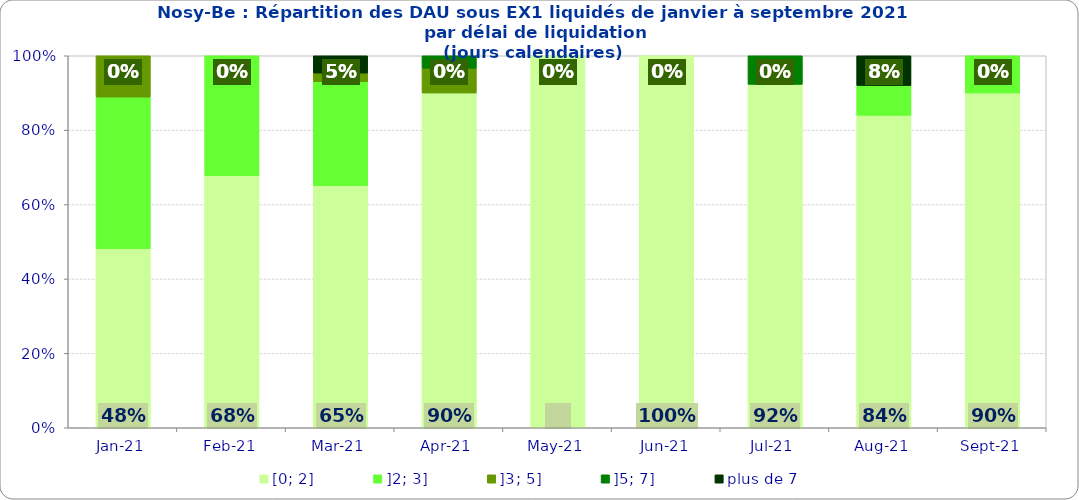
| Category | [0; 2] | ]2; 3] | ]3; 5] | ]5; 7] | plus de 7 |
|---|---|---|---|---|---|
| 2021-01-01 | 0.481 | 0.407 | 0.111 | 0 | 0 |
| 2021-02-01 | 0.677 | 0.323 | 0 | 0 | 0 |
| 2021-03-01 | 0.651 | 0.279 | 0.023 | 0 | 0.047 |
| 2021-04-01 | 0.9 | 0 | 0.067 | 0.033 | 0 |
| 2021-05-01 | 1 | 0 | 0 | 0 | 0 |
| 2021-06-01 | 1 | 0 | 0 | 0 | 0 |
| 2021-07-01 | 0.923 | 0 | 0 | 0.077 | 0 |
| 2021-08-01 | 0.84 | 0.08 | 0 | 0 | 0.08 |
| 2021-09-01 | 0.9 | 0.1 | 0 | 0 | 0 |